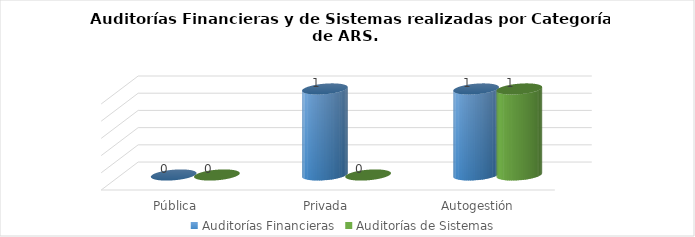
| Category | Auditorías Financieras | Auditorías de Sistemas |
|---|---|---|
| Pública | 0 | 0 |
| Privada | 1 | 0 |
| Autogestión | 1 | 1 |